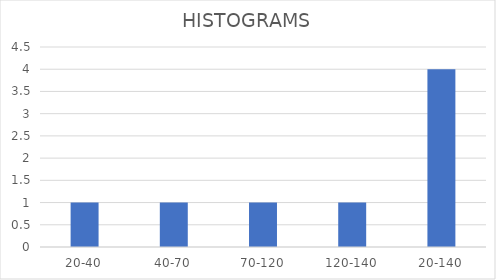
| Category | Series 0 |
|---|---|
| 20-40 | 1 |
| 40-70 | 1 |
| 70-120 | 1 |
| 120-140 | 1 |
| 20-140 | 4 |